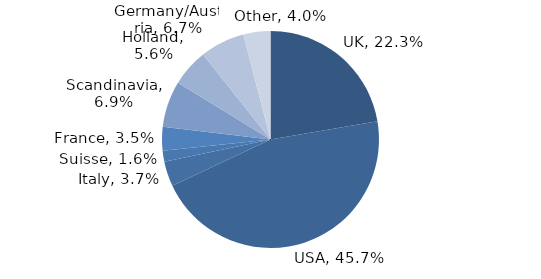
| Category | Investment Style |
|---|---|
| UK | 0.223 |
| USA | 0.457 |
| Italy | 0.037 |
| Suisse | 0.016 |
| France | 0.035 |
| Scandinavia | 0.069 |
| Holland | 0.056 |
| Germany/Austria | 0.067 |
| Other | 0.04 |